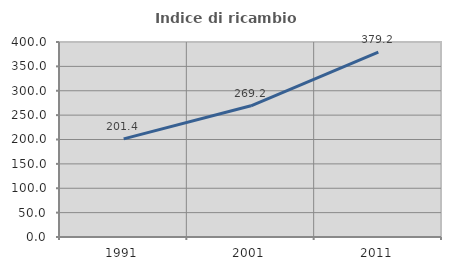
| Category | Indice di ricambio occupazionale  |
|---|---|
| 1991.0 | 201.379 |
| 2001.0 | 269.159 |
| 2011.0 | 379.167 |